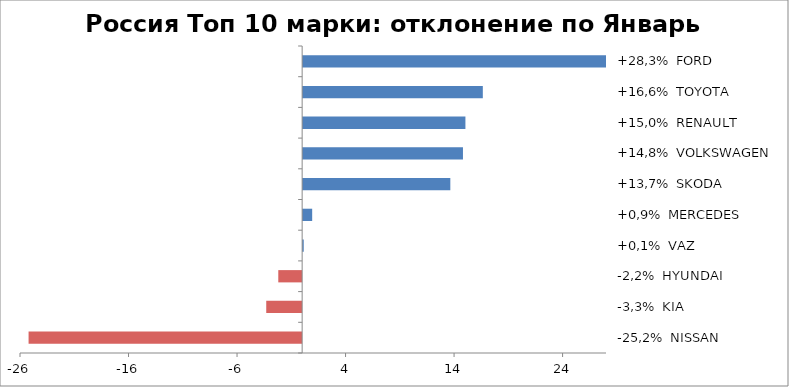
| Category | Россия Топ 10 марки: отклонение по Январь 2016-2015 |
|---|---|
| -25,2%  NISSAN | -25.209 |
| -3,3%  KIA | -3.309 |
| -2,2%  HYUNDAI | -2.199 |
| +0,1%  VAZ | 0.146 |
| +0,9%  MERCEDES | 0.925 |
| +13,7%  SKODA | 13.654 |
| +14,8%  VOLKSWAGEN | 14.819 |
| +15,0%  RENAULT | 15.045 |
| +16,6%  TOYOTA | 16.649 |
| +28,3%  FORD | 28.303 |